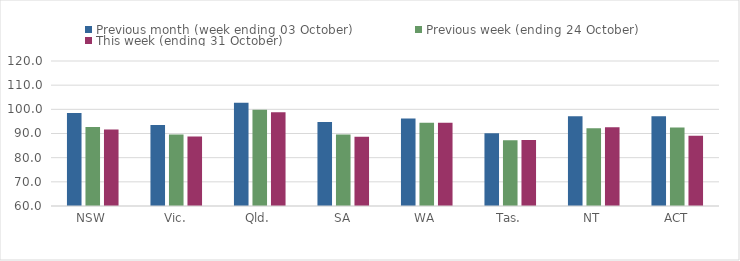
| Category | Previous month (week ending 03 October) | Previous week (ending 24 October) | This week (ending 31 October) |
|---|---|---|---|
| NSW | 98.48 | 92.72 | 91.61 |
| Vic. | 93.48 | 89.6 | 88.79 |
| Qld. | 102.69 | 99.83 | 98.78 |
| SA | 94.76 | 89.58 | 88.63 |
| WA | 96.16 | 94.41 | 94.41 |
| Tas. | 90.12 | 87.19 | 87.28 |
| NT | 97.14 | 92.19 | 92.57 |
| ACT | 97.18 | 92.49 | 89.07 |